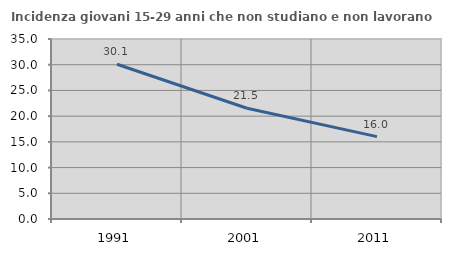
| Category | Incidenza giovani 15-29 anni che non studiano e non lavorano  |
|---|---|
| 1991.0 | 30.097 |
| 2001.0 | 21.535 |
| 2011.0 | 16.022 |